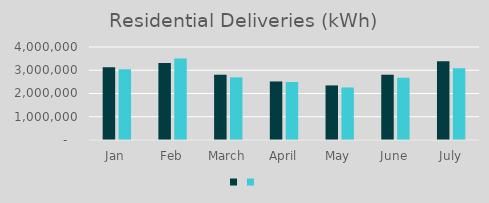
| Category | Series 1 | Series 0 |
|---|---|---|
| Jan | 3124442 | 3040217 |
| Feb | 3307618 | 3510451 |
| March | 2805250 | 2696163 |
| April | 2517652 | 2493703 |
| May | 2348338 | 2261286 |
| June | 2806791 | 2677737 |
| July | 3385366 | 3081914 |